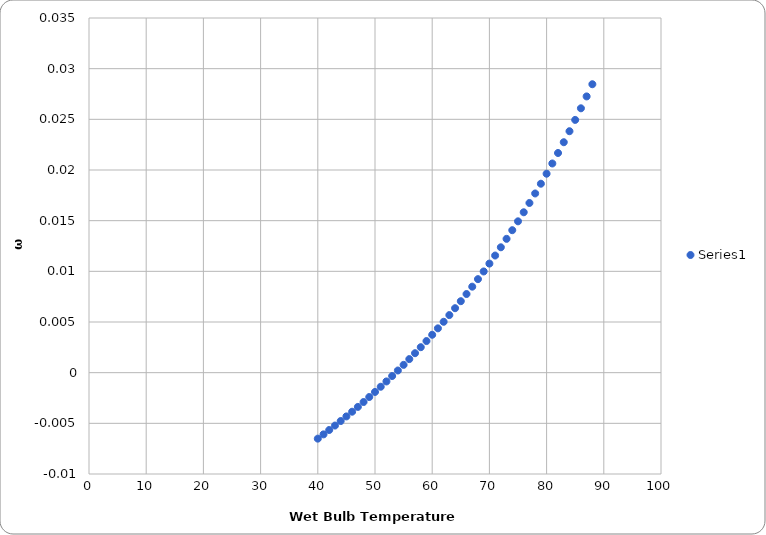
| Category | Series 0 |
|---|---|
| 40.0 | -0.007 |
| 41.0 | -0.006 |
| 42.0 | -0.006 |
| 43.0 | -0.005 |
| 44.0 | -0.005 |
| 45.0 | -0.004 |
| 46.0 | -0.004 |
| 47.0 | -0.003 |
| 48.0 | -0.003 |
| 49.0 | -0.002 |
| 50.0 | -0.002 |
| 51.0 | -0.001 |
| 52.0 | -0.001 |
| 53.0 | 0 |
| 54.0 | 0 |
| 55.0 | 0.001 |
| 56.0 | 0.001 |
| 57.0 | 0.002 |
| 58.0 | 0.003 |
| 59.0 | 0.003 |
| 60.0 | 0.004 |
| 61.0 | 0.004 |
| 62.0 | 0.005 |
| 63.0 | 0.006 |
| 64.0 | 0.006 |
| 65.0 | 0.007 |
| 66.0 | 0.008 |
| 67.0 | 0.008 |
| 68.0 | 0.009 |
| 69.0 | 0.01 |
| 70.0 | 0.011 |
| 71.0 | 0.012 |
| 72.0 | 0.012 |
| 73.0 | 0.013 |
| 74.0 | 0.014 |
| 75.0 | 0.015 |
| 76.0 | 0.016 |
| 77.0 | 0.017 |
| 78.0 | 0.018 |
| 79.0 | 0.019 |
| 80.0 | 0.02 |
| 81.0 | 0.021 |
| 82.0 | 0.022 |
| 83.0 | 0.023 |
| 84.0 | 0.024 |
| 85.0 | 0.025 |
| 86.0 | 0.026 |
| 87.0 | 0.027 |
| 88.0 | 0.028 |